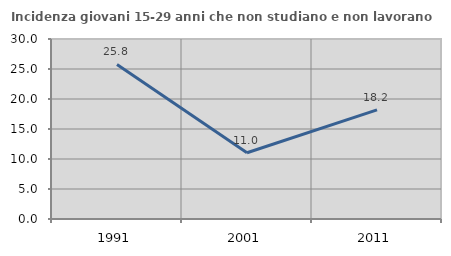
| Category | Incidenza giovani 15-29 anni che non studiano e non lavorano  |
|---|---|
| 1991.0 | 25.758 |
| 2001.0 | 11.05 |
| 2011.0 | 18.182 |